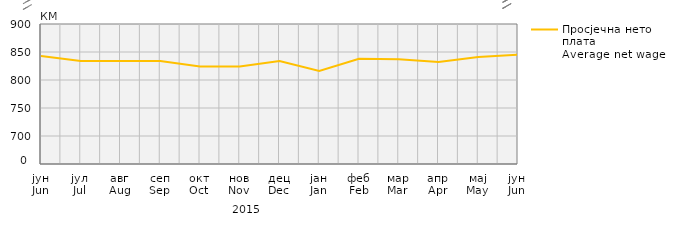
| Category | Просјечна нето плата
Average net wage |
|---|---|
| јун
Jun | 843 |
| јул
Jul | 834 |
| авг
Aug | 834 |
| сеп
Sep | 834 |
| окт
Oct | 824 |
| нов
Nov | 824 |
| дец
Dec | 834 |
| јан
Jan | 816 |
| феб
Feb | 838 |
| мар
Mar | 837 |
| апр
Apr | 832 |
| мај
May | 841 |
| јун
Jun | 845 |